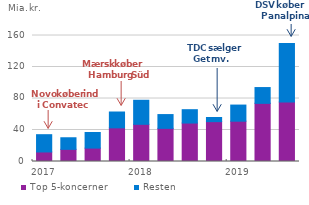
| Category | Top 5-koncerner | Resten  |
|---|---|---|
| 2017.0 | 12.106 | 21.94 |
| 2017.0 | 15.438 | 14.711 |
| 2017.0 | 17.021 | 19.818 |
| 2017.0 | 42.733 | 20.114 |
| 2018.0 | 47.218 | 30.537 |
| 2018.0 | 42.08 | 17.511 |
| 2018.0 | 48.824 | 16.961 |
| 2018.0 | 50.607 | 5.25 |
| 2019.0 | 51.165 | 20.495 |
| 2019.0 | 73.832 | 20.062 |
| 2019.0 | 75.444 | 74.285 |